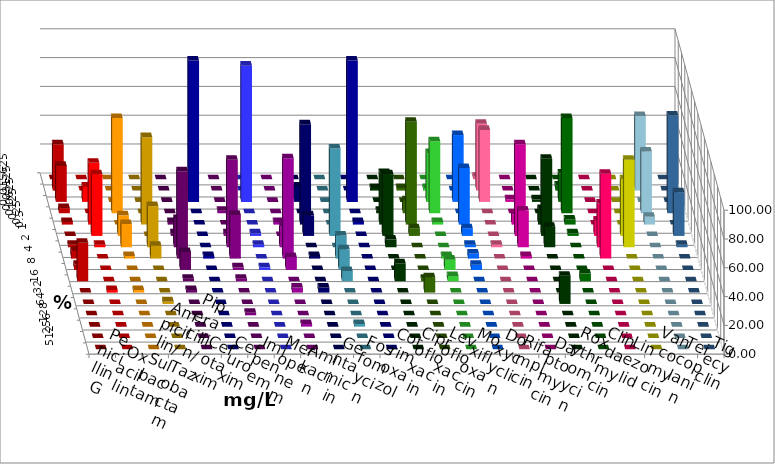
| Category | Penicillin G | Oxacillin | Ampicillin/ Sulbactam | Piperacillin/ Tazobactam | Cefotaxim | Cefuroxim | Imipenem | Meropenem | Amikacin | Gentamicin | Fosfomycin | Cotrimoxazol | Ciprofloxacin | Levofloxacin | Moxifloxacin | Doxycyclin | Rifampicin | Daptomycin | Roxythromycin | Clindamycin | Linezolid | Vancomycin | Teicoplanin | Tigecyclin |
|---|---|---|---|---|---|---|---|---|---|---|---|---|---|---|---|---|---|---|---|---|---|---|---|---|
| 0.015625 | 0 | 0 | 0 | 0 | 0 | 0 | 0 | 0 | 0 | 0 | 0 | 0 | 0 | 0 | 0 | 0 | 1.786 | 0 | 0 | 0 | 0 | 0 | 0 | 0 |
| 0.03125 | 32.143 | 0 | 0 | 0 | 0 | 0 | 0 | 0 | 0 | 0 | 0 | 0 | 1.786 | 1.786 | 1.786 | 0 | 46.429 | 0 | 0 | 3.571 | 0 | 0 | 0 | 51.786 |
| 0.0625 | 25 | 10.714 | 0 | 0 | 0 | 0 | 98.214 | 94.643 | 0 | 10.714 | 0 | 98.214 | 0 | 0 | 33.929 | 46.429 | 50 | 1.818 | 1.786 | 19.643 | 0 | 0 | 0 | 0 |
| 0.125 | 3.571 | 0 | 66.071 | 0 | 0 | 1.786 | 0 | 0 | 0 | 0 | 0 | 0 | 1.786 | 8.929 | 50 | 0 | 0 | 0 | 0 | 66.071 | 0 | 0 | 67.857 | 42.857 |
| 0.25 | 1.786 | 42.857 | 0 | 60.714 | 1.786 | 0 | 0 | 0 | 1.786 | 69.643 | 0 | 1.786 | 35.714 | 71.429 | 1.786 | 39.286 | 0 | 7.273 | 10.714 | 3.571 | 0 | 0 | 0 | 5.357 |
| 0.5 | 0 | 42.857 | 14.286 | 0 | 1.786 | 1.786 | 0 | 1.786 | 0 | 14.286 | 60.714 | 0 | 42.857 | 5.357 | 0 | 5.357 | 0 | 63.636 | 53.571 | 1.786 | 10.714 | 39.286 | 30.357 | 0 |
| 1.0 | 1.786 | 1.786 | 16.071 | 28.571 | 19.643 | 60.714 | 0 | 1.786 | 14.286 | 0 | 0 | 0 | 5.357 | 0 | 0 | 1.786 | 1.786 | 25.455 | 14.286 | 0 | 30.357 | 60.714 | 1.786 | 0 |
| 2.0 | 5.357 | 0 | 1.786 | 8.929 | 60.714 | 30.357 | 1.786 | 0 | 69.643 | 1.786 | 16.071 | 0 | 0 | 0 | 1.786 | 3.571 | 0 | 1.818 | 0 | 0 | 58.929 | 0 | 0 | 0 |
| 4.0 | 3.571 | 0 | 0 | 0 | 12.5 | 1.786 | 0 | 1.786 | 8.929 | 0 | 14.286 | 0 | 0 | 0 | 7.143 | 3.571 | 0 | 0 | 0 | 0 | 0 | 0 | 0 | 0 |
| 8.0 | 26.786 | 0 | 0 | 0 | 1.786 | 1.786 | 0 | 0 | 0 | 0 | 7.143 | 0 | 12.5 | 1.786 | 3.571 | 0 | 0 | 0 | 0 | 5.357 | 0 | 0 | 0 | 0 |
| 16.0 | 0 | 1.786 | 1.786 | 0 | 1.786 | 0 | 0 | 0 | 3.571 | 3.571 | 0 | 0 | 0 | 10.714 | 0 | 0 | 0 | 0 | 0 | 0 | 0 | 0 | 0 | 0 |
| 32.0 | 0 | 0 | 0 | 1.786 | 0 | 0 | 0 | 0 | 0 | 0 | 0 | 0 | 0 | 0 | 0 | 0 | 0 | 0 | 19.643 | 0 | 0 | 0 | 0 | 0 |
| 64.0 | 0 | 0 | 0 | 0 | 0 | 1.786 | 0 | 0 | 0 | 0 | 0 | 0 | 0 | 0 | 0 | 0 | 0 | 0 | 0 | 0 | 0 | 0 | 0 | 0 |
| 128.0 | 0 | 0 | 0 | 0 | 0 | 0 | 0 | 0 | 1.786 | 0 | 1.786 | 0 | 0 | 0 | 0 | 0 | 0 | 0 | 0 | 0 | 0 | 0 | 0 | 0 |
| 256.0 | 0 | 0 | 0 | 0 | 0 | 0 | 0 | 0 | 0 | 0 | 0 | 0 | 0 | 0 | 0 | 0 | 0 | 0 | 0 | 0 | 0 | 0 | 0 | 0 |
| 512.0 | 0 | 0 | 0 | 0 | 0 | 0 | 0 | 0 | 0 | 0 | 0 | 0 | 0 | 0 | 0 | 0 | 0 | 0 | 0 | 0 | 0 | 0 | 0 | 0 |